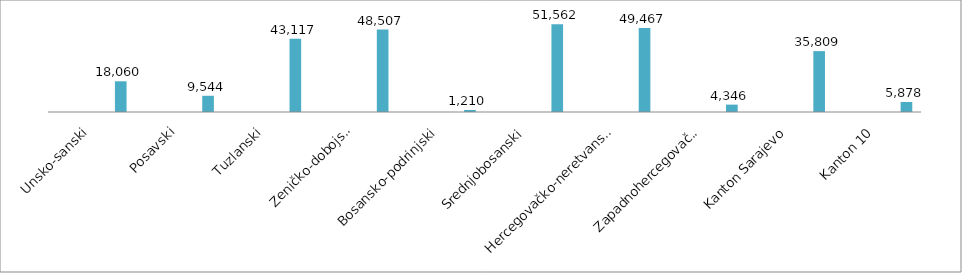
| Category | Series 0 | Series 1 | Series 2 | Series 3 | Series 4 |
|---|---|---|---|---|---|
| Unsko-sanski |  |  |  |  | 18060 |
| Posavski |  |  |  |  | 9544 |
| Tuzlanski |  |  |  |  | 43117 |
| Zeničko-dobojski |  |  |  |  | 48507 |
| Bosansko-podrinjski |  |  |  |  | 1210 |
| Srednjobosanski |  |  |  |  | 51562 |
| Hercegovačko-neretvanski |  |  |  |  | 49467 |
| Zapadnohercegovački |  |  |  |  | 4346 |
| Kanton Sarajevo |  |  |  |  | 35809 |
| Kanton 10 |  |  |  |  | 5878 |